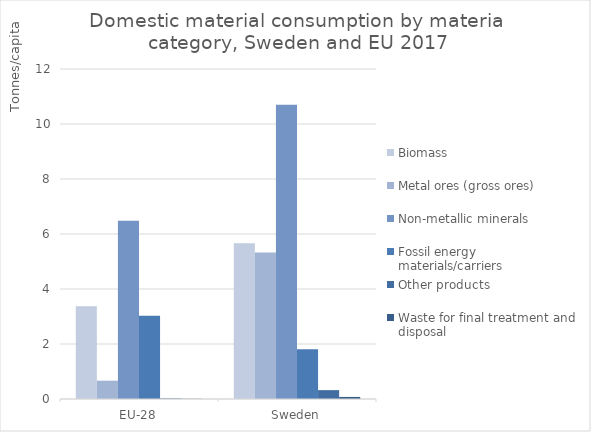
| Category | Biomass | Metal ores (gross ores) | Non-metallic minerals | Fossil energy materials/carriers | Other products | Waste for final treatment and disposal |
|---|---|---|---|---|---|---|
| EU-28 | 3.376 | 0.666 | 6.48 | 3.028 | 0.021 | 0.007 |
| Sweden | 5.661 | 5.325 | 10.7 | 1.805 | 0.323 | 0.075 |